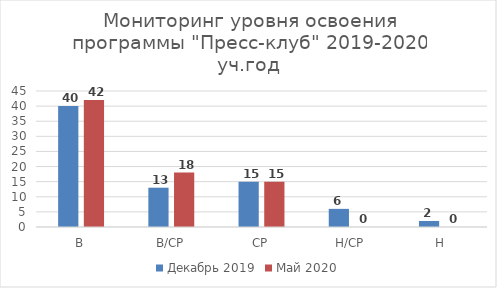
| Category | Декабрь 2019 | Май 2020 |
|---|---|---|
| В | 40 | 42 |
| В/СР | 13 | 18 |
| СР | 15 | 15 |
| Н/СР | 6 | 0 |
| Н | 2 | 0 |